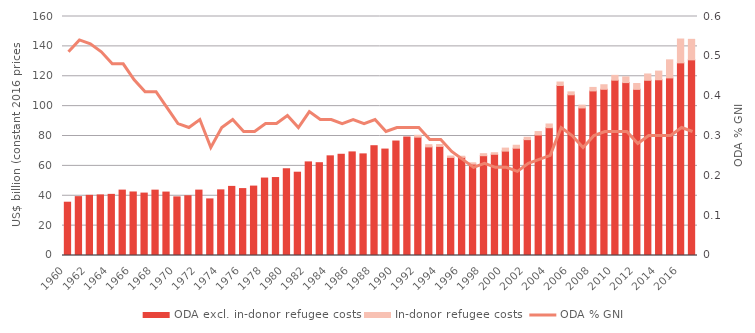
| Category | ODA excl. in-donor refugee costs | In-donor refugee costs |
|---|---|---|
| 1960 | 35673.917 | 0 |
| 1961 | 39410.357 | 0 |
| 1962 | 40267.227 | 0 |
| 1963 | 40559.885 | 0 |
| 1964 | 40926.727 | 0 |
| 1965 | 43778.007 | 0 |
| 1966 | 42528.688 | 0 |
| 1967 | 41783.893 | 0 |
| 1968 | 43755.819 | 0 |
| 1969 | 42462.441 | 0 |
| 1970 | 39249.908 | 0 |
| 1971 | 39991.183 | 0 |
| 1972 | 43776.184 | 0 |
| 1973 | 37893.636 | 0 |
| 1974 | 43945.296 | 0 |
| 1975 | 46262.927 | 0 |
| 1976 | 44797.183 | 0 |
| 1977 | 46463.97 | 0 |
| 1978 | 51845.247 | 0 |
| 1979 | 52192.831 | 0 |
| 1980 | 57994.428 | 0 |
| 1981 | 55762.896 | 0 |
| 1982 | 62664.378 | 0 |
| 1983 | 62125.148 | 0 |
| 1984 | 66718.688 | 0 |
| 1985 | 67771.713 | 0 |
| 1986 | 69351.101 | 0 |
| 1987 | 68031.243 | 0 |
| 1988 | 73496.746 | 0 |
| 1989 | 71248.761 | 0 |
| 1990 | 76634.971 | 0 |
| 1991 | 79322.601 | 0 |
| 1992 | 79228.398 | 1241.713 |
| 1993 | 72703.166 | 1484.467 |
| 1994 | 73034.424 | 1291.702 |
| 1995 | 65677.206 | 923.433 |
| 1996 | 65691.638 | 773.127 |
| 1997 | 61199.102 | 866.075 |
| 1998 | 66811.232 | 1363.864 |
| 1999 | 67746.714 | 1073.014 |
| 2000 | 69878.947 | 2028.249 |
| 2001 | 71825.521 | 1985.963 |
| 2002 | 77569.406 | 1596.601 |
| 2003 | 80673.323 | 2301.548 |
| 2004 | 85553.343 | 2485.416 |
| 2005 | 113817.302 | 2310.519 |
| 2006 | 107598.346 | 1958.272 |
| 2007 | 98788.551 | 1886.065 |
| 2008 | 110178.414 | 2337.225 |
| 2009 | 111280.669 | 3037.649 |
| 2010 | 117360.896 | 3236.932 |
| 2011 | 115748.141 | 3847.077 |
| 2012 | 111230.932 | 3907.588 |
| 2013 | 117289.619 | 4239.535 |
| 2014 | 117642.415 | 5815.215 |
| 2015 | 118894.398 | 12095.56 |
| 2016 | 128961.04 | 15959.51 |
| 2017 | 130979.586 | 13727.673 |